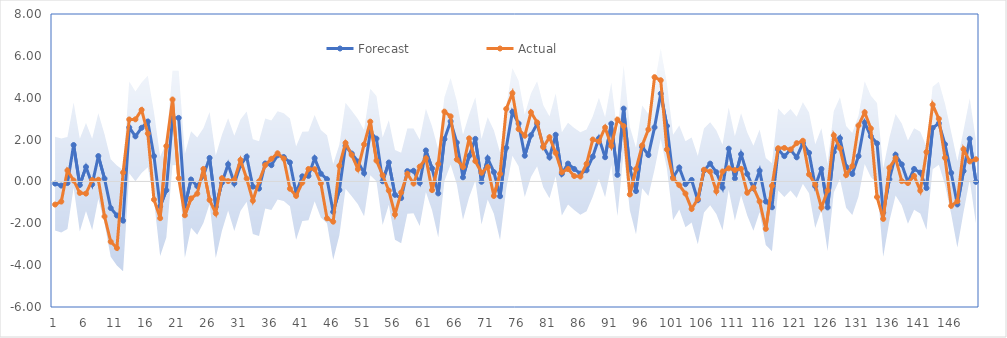
| Category | Forecast | Actual |
|---|---|---|
| 0 | -0.104 | -1.104 |
| 1 | -0.199 | -0.964 |
| 2 | -0.078 | 0.525 |
| 3 | 1.74 | 0.045 |
| 4 | -0.173 | -0.549 |
| 5 | 0.693 | -0.581 |
| 6 | -0.141 | 0.066 |
| 7 | 1.212 | 0.082 |
| 8 | 0.133 | -1.674 |
| 9 | -1.272 | -2.88 |
| 10 | -1.626 | -3.181 |
| 11 | -1.873 | 0.42 |
| 12 | 2.58 | 2.96 |
| 13 | 2.154 | 2.968 |
| 14 | 2.562 | 3.419 |
| 15 | 2.862 | 2.29 |
| 16 | 1.209 | -0.871 |
| 17 | -1.191 | -1.755 |
| 18 | -0.421 | 1.691 |
| 19 | 3.028 | 3.914 |
| 20 | 3.036 | 0.157 |
| 21 | -1.165 | -1.616 |
| 22 | 0.09 | -0.813 |
| 23 | -0.227 | -0.586 |
| 24 | 0.281 | 0.597 |
| 25 | 1.123 | -0.885 |
| 26 | -1.214 | -1.524 |
| 27 | -0.06 | 0.155 |
| 28 | 0.818 | 0.016 |
| 29 | -0.092 | 0.079 |
| 30 | 0.777 | 1.024 |
| 31 | 1.184 | 0.135 |
| 32 | -0.247 | -0.922 |
| 33 | -0.343 | 0.004 |
| 34 | 0.858 | 0.776 |
| 35 | 0.776 | 1.082 |
| 36 | 1.249 | 1.345 |
| 37 | 1.166 | 1.089 |
| 38 | 0.906 | -0.348 |
| 39 | -0.558 | -0.692 |
| 40 | 0.245 | -0.061 |
| 41 | 0.264 | 0.596 |
| 42 | 1.109 | 0.584 |
| 43 | 0.37 | -0.088 |
| 44 | 0.107 | -1.762 |
| 45 | -1.457 | -1.923 |
| 46 | -0.412 | 0.745 |
| 47 | 1.703 | 1.839 |
| 48 | 1.332 | 1.267 |
| 49 | 0.948 | 0.587 |
| 50 | 0.395 | 1.766 |
| 51 | 2.358 | 2.855 |
| 52 | 2.045 | 0.995 |
| 53 | 0.007 | 0.293 |
| 54 | 0.904 | -0.439 |
| 55 | -0.641 | -1.578 |
| 56 | -0.794 | -0.531 |
| 57 | 0.492 | 0.366 |
| 58 | 0.509 | -0.099 |
| 59 | -0.068 | 0.707 |
| 60 | 1.481 | 1.107 |
| 61 | 0.623 | -0.415 |
| 62 | -0.573 | 0.834 |
| 63 | 2.02 | 3.335 |
| 64 | 2.87 | 3.109 |
| 65 | 1.856 | 1.046 |
| 66 | 0.198 | 0.691 |
| 67 | 1.223 | 2.058 |
| 68 | 2.033 | 0.97 |
| 69 | -0.017 | 0.414 |
| 70 | 1.103 | 0.687 |
| 71 | 0.448 | -0.694 |
| 72 | -0.706 | 0.359 |
| 73 | 1.606 | 3.466 |
| 74 | 3.323 | 4.217 |
| 75 | 2.768 | 2.499 |
| 76 | 1.228 | 2.183 |
| 77 | 2.208 | 3.304 |
| 78 | 2.754 | 2.821 |
| 79 | 1.677 | 1.634 |
| 80 | 1.15 | 2.112 |
| 81 | 2.229 | 1.364 |
| 82 | 0.362 | 0.439 |
| 83 | 0.851 | 0.592 |
| 84 | 0.595 | 0.258 |
| 85 | 0.375 | 0.234 |
| 86 | 0.531 | 0.84 |
| 87 | 1.184 | 2.002 |
| 88 | 2.063 | 1.909 |
| 89 | 1.157 | 2.577 |
| 90 | 2.759 | 1.697 |
| 91 | 0.314 | 2.956 |
| 92 | 3.479 | 2.646 |
| 93 | 0.623 | -0.622 |
| 94 | -0.461 | 0.591 |
| 95 | 1.65 | 1.722 |
| 96 | 1.263 | 2.482 |
| 97 | 2.583 | 4.981 |
| 98 | 4.194 | 4.835 |
| 99 | 2.649 | 1.53 |
| 100 | 0.19 | 0.143 |
| 101 | 0.663 | -0.179 |
| 102 | -0.132 | -0.58 |
| 103 | 0.07 | -1.315 |
| 104 | -0.898 | -0.838 |
| 105 | 0.522 | 0.558 |
| 106 | 0.85 | 0.468 |
| 107 | 0.442 | -0.47 |
| 108 | -0.291 | 0.475 |
| 109 | 1.564 | 0.627 |
| 110 | 0.147 | 0.542 |
| 111 | 1.302 | 0.6 |
| 112 | 0.355 | -0.542 |
| 113 | -0.325 | -0.295 |
| 114 | 0.515 | -0.959 |
| 115 | -0.959 | -2.268 |
| 116 | -1.234 | -0.211 |
| 117 | 1.524 | 1.585 |
| 118 | 1.209 | 1.599 |
| 119 | 1.511 | 1.523 |
| 120 | 1.152 | 1.828 |
| 121 | 1.835 | 1.943 |
| 122 | 1.365 | 0.338 |
| 123 | -0.226 | -0.149 |
| 124 | 0.596 | -1.252 |
| 125 | -1.243 | -0.433 |
| 126 | 1.409 | 2.205 |
| 127 | 2.066 | 1.59 |
| 128 | 0.696 | 0.303 |
| 129 | 0.356 | 0.735 |
| 130 | 1.207 | 2.672 |
| 131 | 2.811 | 3.302 |
| 132 | 2.155 | 2.529 |
| 133 | 1.818 | -0.745 |
| 134 | -1.493 | -1.79 |
| 135 | 0.099 | 0.654 |
| 136 | 1.273 | 1.108 |
| 137 | 0.814 | 0.014 |
| 138 | -0.031 | -0.078 |
| 139 | 0.595 | 0.262 |
| 140 | 0.421 | -0.439 |
| 141 | -0.319 | 1.404 |
| 142 | 2.553 | 3.666 |
| 143 | 2.778 | 2.991 |
| 144 | 1.774 | 1.129 |
| 145 | 0.405 | -1.167 |
| 146 | -1.1 | -0.948 |
| 147 | 0.496 | 1.541 |
| 148 | 2.036 | 0.956 |
| 149 | -0.02 | 1.058 |